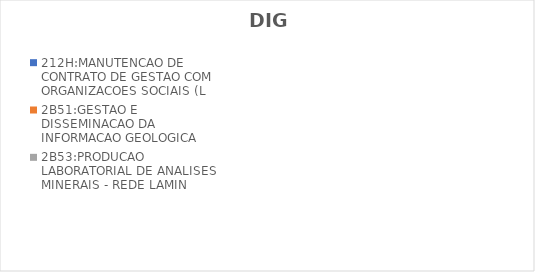
| Category | 212H:MANUTENCAO DE CONTRATO DE GESTAO COM ORGANIZACOES SOCIAIS (L | 2B51:GESTAO E DISSEMINACAO DA INFORMACAO GEOLOGICA | 2B53:PRODUCAO LABORATORIAL DE ANALISES MINERAIS - REDE LAMIN |
|---|---|---|---|
| EXECUTADO | 0 | 0.662 | 0.328 |